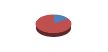
| Category | Series 0 |
|---|---|
| % USO | 0.152 |
| % DISP. | 0.848 |